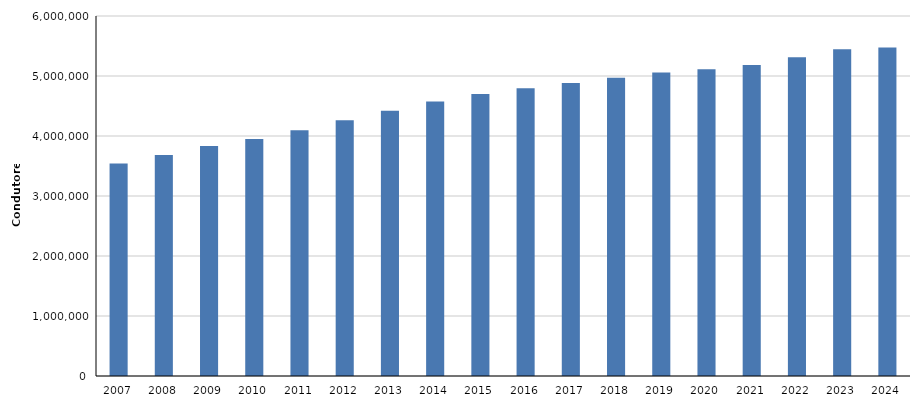
| Category | Condutores |
|---|---|
| 2007 | 3539613 |
| 2008 | 3682350 |
| 2009 | 3831983 |
| 2010 | 3948573 |
| 2011 | 4094720 |
| 2012 | 4263824 |
| 2013 | 4419160 |
| 2014 | 4576292 |
| 2015 | 4698831 |
| 2016 | 4794438 |
| 2017 | 4883070 |
| 2018 | 4970737 |
| 2019 | 5060058 |
| 2020 | 5113756 |
| 2021 | 5184621 |
| 2022 | 5313853 |
| 2023 | 5447334 |
| 2024 | 5474164 |